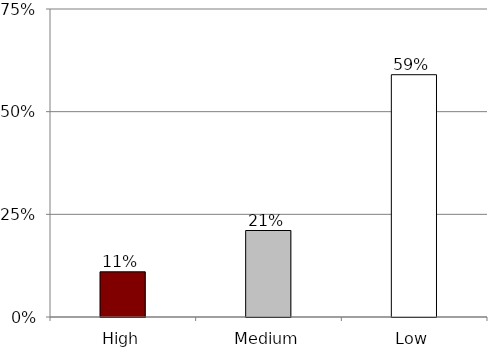
| Category | College |
|---|---|
| High | 0.11 |
| Medium | 0.211 |
| Low | 0.59 |